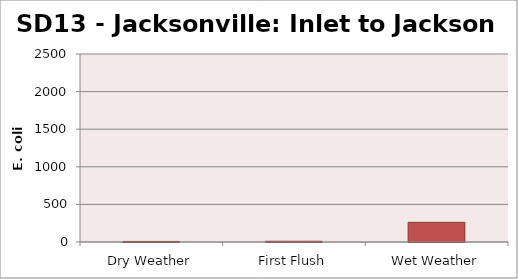
| Category | E. coli MPN |
|---|---|
| Dry Weather | 7.4 |
| First Flush | 9.8 |
| Wet Weather | 261.3 |